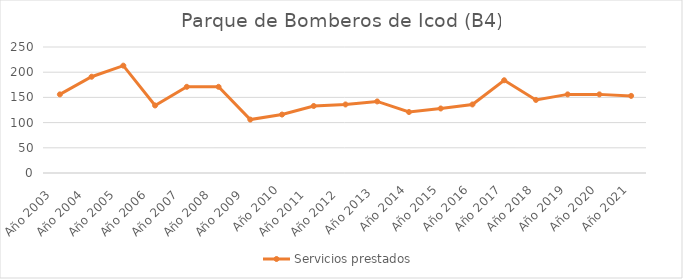
| Category | Servicios prestados  |
|---|---|
| Año 2003   | 156 |
| Año 2004   | 191 |
| Año 2005   | 213 |
| Año 2006   | 134 |
| Año 2007   | 171 |
| Año 2008   | 171 |
| Año 2009   | 106 |
| Año 2010 | 116 |
| Año 2011   | 133 |
| Año 2012   | 136 |
| Año 2013  | 142 |
| Año 2014 | 121 |
| Año 2015 | 128 |
| Año 2016 | 136 |
| Año 2017 | 184 |
| Año 2018 | 145 |
| Año 2019 | 156 |
| Año 2020 | 156 |
| Año 2021 | 153 |